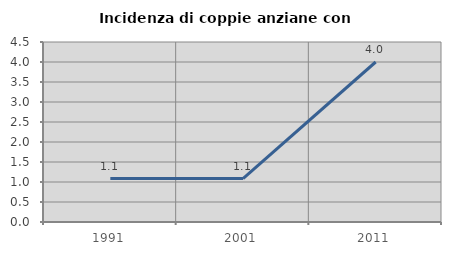
| Category | Incidenza di coppie anziane con figli |
|---|---|
| 1991.0 | 1.087 |
| 2001.0 | 1.087 |
| 2011.0 | 4 |